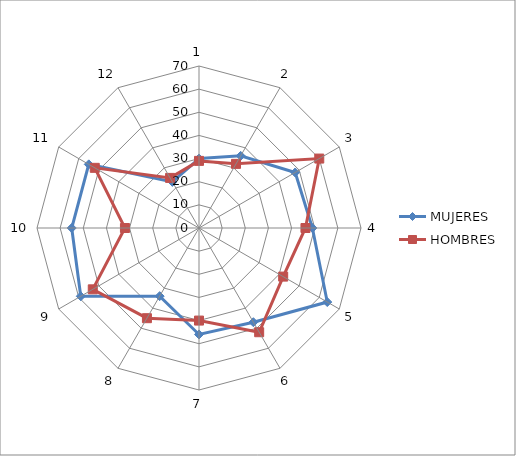
| Category | MUJERES | HOMBRES |
|---|---|---|
| 0 | 30 | 29 |
| 1 | 36 | 32 |
| 2 | 48 | 60 |
| 3 | 49 | 46 |
| 4 | 64 | 42 |
| 5 | 47 | 52 |
| 6 | 46 | 40 |
| 7 | 34 | 45 |
| 8 | 59 | 53 |
| 9 | 55 | 32 |
| 10 | 55 | 52 |
| 11 | 23 | 25 |